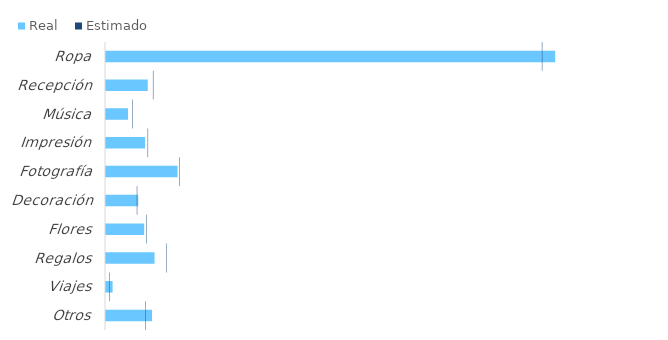
| Category | Real |
|---|---|
| Ropa | 9770 |
| Recepción | 928 |
| Música | 500 |
| Impresión | 870 |
| Fotografía | 1575 |
| Decoración | 720 |
| Flores | 850 |
| Regalos | 1075 |
| Viajes | 165 |
| Otros | 1021 |